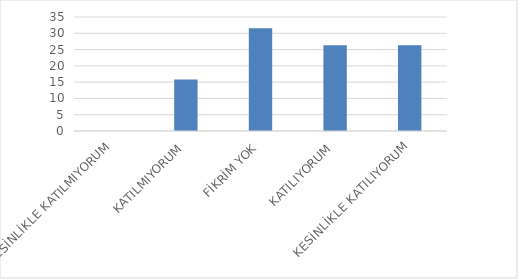
| Category | Series 0 |
|---|---|
| KESİNLİKLE KATILMIYORUM | 0 |
| KATILMIYORUM | 15.79 |
| FİKRİM YOK | 31.58 |
| KATILIYORUM | 26.32 |
| KESİNLİKLE KATILIYORUM | 26.32 |